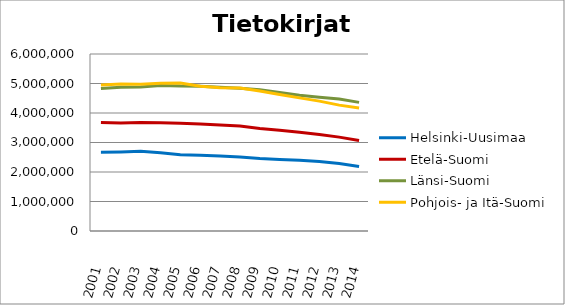
| Category | Helsinki-Uusimaa | Etelä-Suomi | Länsi-Suomi | Pohjois- ja Itä-Suomi |
|---|---|---|---|---|
| 2001.0 | 2671766 | 3676460 | 4832049 | 4947622 |
| 2002.0 | 2680857 | 3659607 | 4875067 | 4986126 |
| 2003.0 | 2701812 | 3676475 | 4882737 | 4977738 |
| 2004.0 | 2653430 | 3668223 | 4936086 | 5006347 |
| 2005.0 | 2588633 | 3651974 | 4911968 | 5018093 |
| 2006.0 | 2570903 | 3628780 | 4906048 | 4904008 |
| 2007.0 | 2539990 | 3595427 | 4875066 | 4857198 |
| 2008.0 | 2504508 | 3559230 | 4842752 | 4847204 |
| 2009.0 | 2456468 | 3476050 | 4785505 | 4744890 |
| 2010.0 | 2427710 | 3412616 | 4693319 | 4625817 |
| 2011.0 | 2395802 | 3345575 | 4601833 | 4513175 |
| 2012.0 | 2358594 | 3267550 | 4534604 | 4402161 |
| 2013.0 | 2287255 | 3182245 | 4473699 | 4266344 |
| 2014.0 | 2188803 | 3066023 | 4359532 | 4168913 |